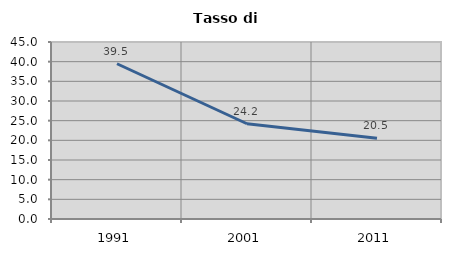
| Category | Tasso di disoccupazione   |
|---|---|
| 1991.0 | 39.472 |
| 2001.0 | 24.217 |
| 2011.0 | 20.541 |